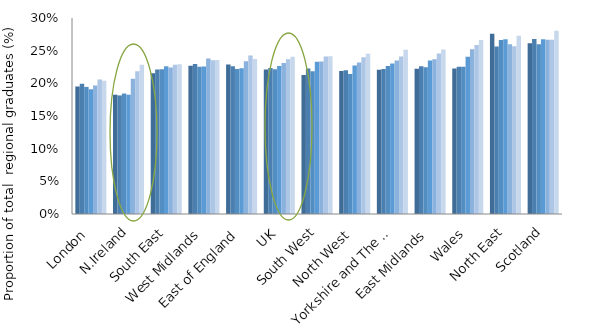
| Category | 2009 | 2010 | 2011 | 2012 | 2013 | 2014 | 2015 |
|---|---|---|---|---|---|---|---|
| London | 0.195 | 0.199 | 0.195 | 0.191 | 0.197 | 0.206 | 0.204 |
| N.Ireland | 0.183 | 0.181 | 0.184 | 0.183 | 0.207 | 0.219 | 0.228 |
| South East | 0.215 | 0.221 | 0.222 | 0.226 | 0.224 | 0.229 | 0.229 |
| West Midlands | 0.227 | 0.23 | 0.225 | 0.226 | 0.238 | 0.235 | 0.236 |
| East of England | 0.229 | 0.226 | 0.222 | 0.223 | 0.234 | 0.243 | 0.237 |
| UK | 0.221 | 0.224 | 0.221 | 0.227 | 0.231 | 0.237 | 0.241 |
| South West | 0.213 | 0.223 | 0.219 | 0.233 | 0.233 | 0.241 | 0.241 |
| North West | 0.219 | 0.22 | 0.214 | 0.227 | 0.232 | 0.24 | 0.245 |
| Yorkshire and The Humber | 0.221 | 0.222 | 0.227 | 0.23 | 0.235 | 0.241 | 0.252 |
| East Midlands | 0.222 | 0.226 | 0.225 | 0.235 | 0.237 | 0.246 | 0.252 |
| Wales | 0.223 | 0.225 | 0.225 | 0.241 | 0.252 | 0.259 | 0.266 |
| North East | 0.276 | 0.256 | 0.266 | 0.267 | 0.26 | 0.257 | 0.273 |
| Scotland | 0.261 | 0.268 | 0.26 | 0.268 | 0.267 | 0.267 | 0.28 |